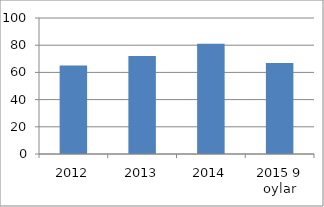
| Category | Series 0 |
|---|---|
| 2012 | 65 |
| 2013 | 72 |
| 2014 | 81 |
| 2015 9 oylar | 67 |